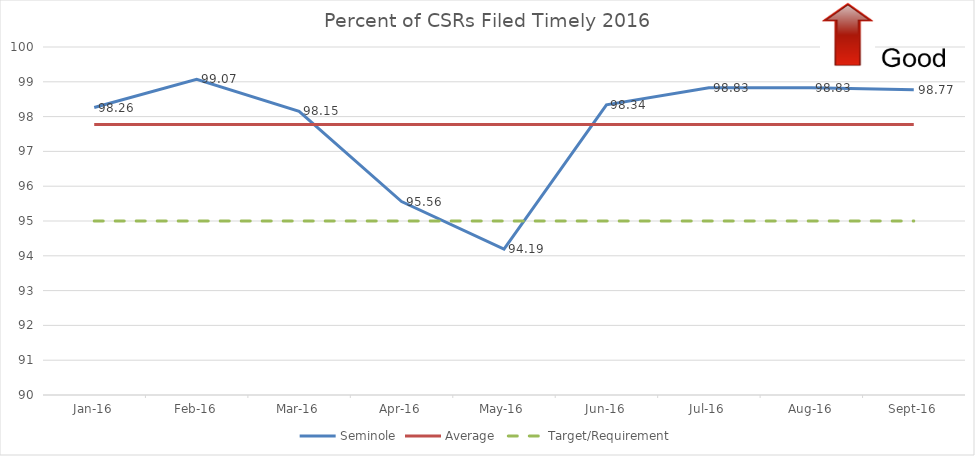
| Category | Seminole | Average  | Target/Requirement |
|---|---|---|---|
| 2016-01-16 | 98.26 | 97.77 | 95 |
| 2016-02-16 | 99.07 | 97.77 | 95 |
| 2016-03-16 | 98.15 | 97.77 | 95 |
| 2016-04-01 | 95.56 | 97.77 | 95 |
| 2016-05-16 | 94.19 | 97.77 | 95 |
| 2016-06-16 | 98.34 | 97.77 | 95 |
| 2016-07-16 | 98.83 | 97.77 | 95 |
| 2016-08-16 | 98.83 | 97.77 | 95 |
| 2016-09-16 | 98.77 | 97.77 | 95 |